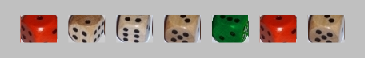
| Category | 1 | 2 | 3 | 4 | 5 | 6 |
|---|---|---|---|---|---|---|
| 1.0 | 1 | 0 | 0 | 0 | 0 | 0 |
| 2.0 | -1 | 1 | 0 | 0 | 0 | 0 |
| 4.0 | -1 | 0 | 0 | 1 | 0 | 0 |
| 3.0 | -1 | 0 | 1 | 0 | 0 | 0 |
| 6.0 | -1 | 0 | 0 | 0 | 0 | 1 |
| 1.0 | 1 | 0 | 0 | 0 | 0 | 0 |
| 3.0 | -1 | 0 | 1 | 0 | 0 | 0 |